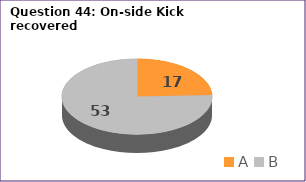
| Category | Series 0 |
|---|---|
| A | 17 |
| B | 53 |